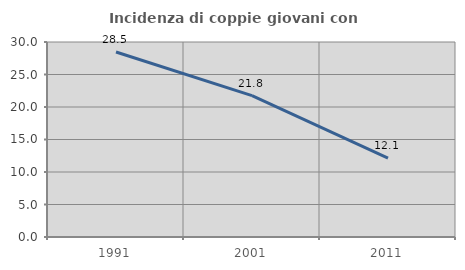
| Category | Incidenza di coppie giovani con figli |
|---|---|
| 1991.0 | 28.463 |
| 2001.0 | 21.755 |
| 2011.0 | 12.145 |